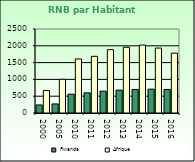
| Category | Rwanda | Afrique                        |
|---|---|---|
| 2000.0 | 240 | 668.557 |
| 2005.0 | 270 | 1002.896 |
| 2010.0 | 560 | 1608.999 |
| 2011.0 | 600 | 1686.521 |
| 2012.0 | 650 | 1885.129 |
| 2013.0 | 680 | 1956.671 |
| 2014.0 | 700 | 2022.289 |
| 2015.0 | 710 | 1932.283 |
| 2016.0 | 700 | 1781.415 |